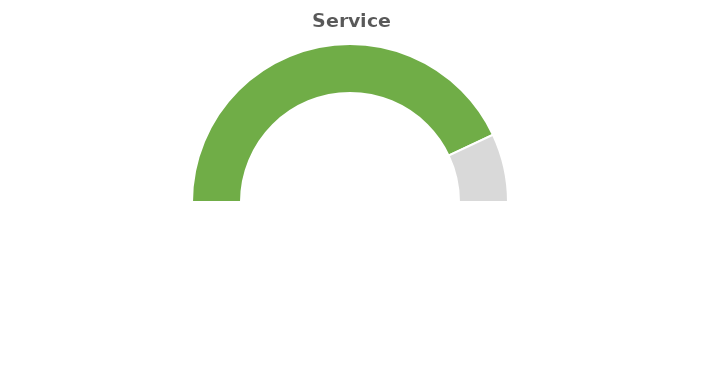
| Category | Series 0 |
|---|---|
| 0 | 0.86 |
| 1 | 0.14 |
| 2 | 1 |